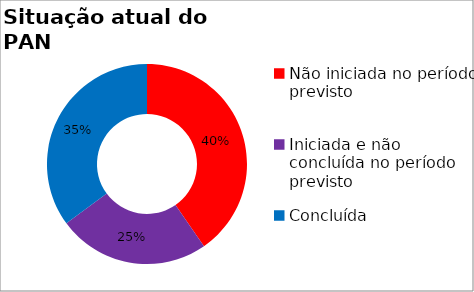
| Category | Series 0 |
|---|---|
| Não iniciada no período previsto | 0.404 |
| Iniciada e não concluída no período previsto | 0.246 |
| Concluída | 0.351 |